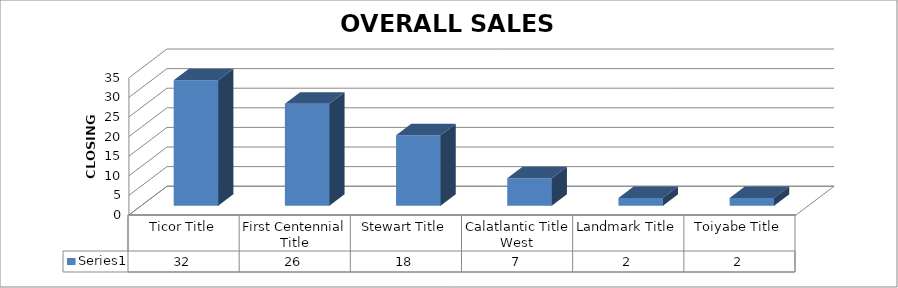
| Category | Series 0 |
|---|---|
| Ticor Title | 32 |
| First Centennial Title | 26 |
| Stewart Title | 18 |
| Calatlantic Title West | 7 |
| Landmark Title | 2 |
| Toiyabe Title | 2 |